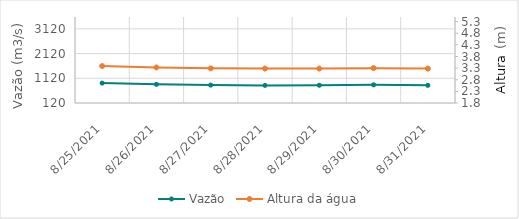
| Category | Vazão |
|---|---|
| 8/1/21 | 854.67 |
| 7/31/21 | 839.16 |
| 7/30/21 | 838.9 |
| 7/29/21 | 811.17 |
| 7/28/21 | 751.25 |
| 7/27/21 | 775.59 |
| 7/26/21 | 766.9 |